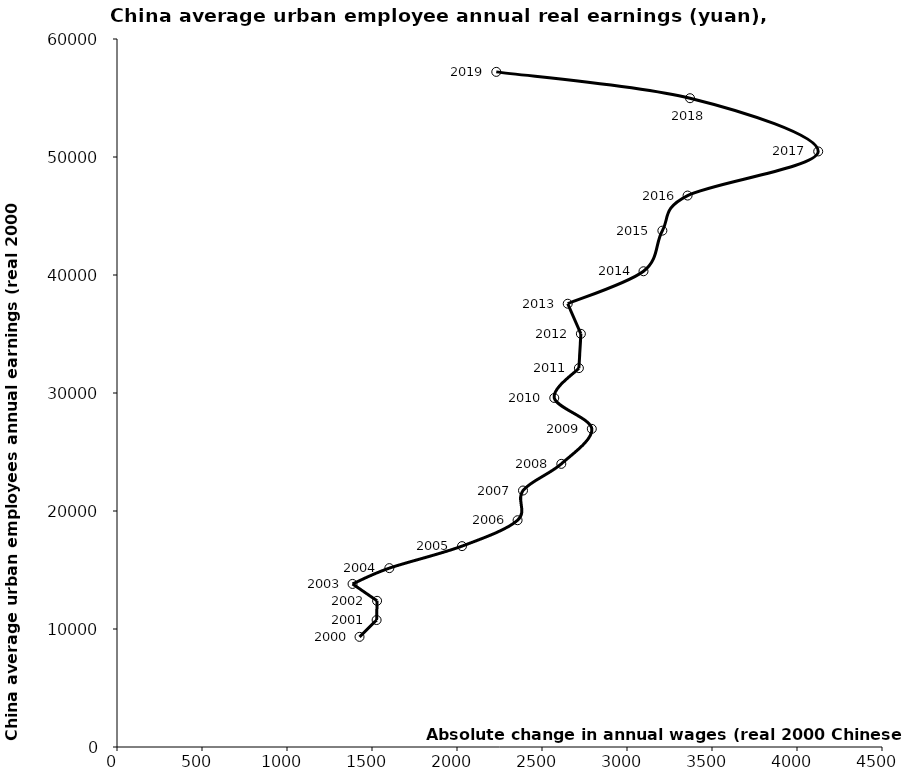
| Category | Series 0 |
|---|---|
| 1426.6247139588104 | 9333 |
| 1527.1355247981546 | 10759.625 |
| 1529.8594004858332 | 12387.271 |
| 1385.653637114965 | 13819.344 |
| 1601.9661735692434 | 15158.578 |
| 2029.5261247110839 | 17023.276 |
| 2356.3867853350494 | 19217.631 |
| 2388.249951562135 | 21736.049 |
| 2613.570659353012 | 23994.13 |
| 2793.0168360535426 | 26963.191 |
| 2572.1798455163953 | 29580.164 |
| 2717.0302252253587 | 32107.55 |
| 2728.6911540132496 | 35014.225 |
| 2651.318555982263 | 37564.933 |
| 3097.0736117439083 | 40316.862 |
| 3208.0599812058827 | 43759.08 |
| 3356.4537384940995 | 46732.982 |
| 4124.732085454467 | 50471.987 |
| 3370.7611954792483 | 54982.446 |
| 2231.063997723184 | 57213.51 |